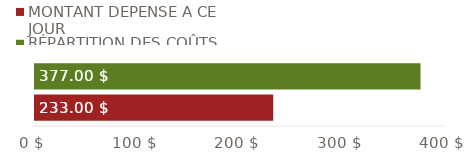
| Category | MONTANT DÉPENSÉ À CE JOUR | RÉPARTITION DES COÛTS |
|---|---|---|
| TOTAUX | 233 | 377 |